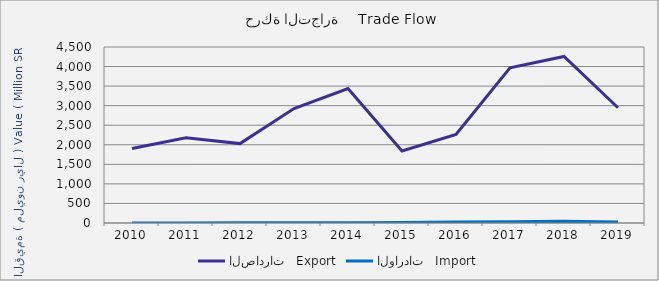
| Category | الصادرات   Export | الواردات   Import |
|---|---|---|
| 2010.0 | 1904602172 | 422353 |
| 2011.0 | 2181873037 | 906222 |
| 2012.0 | 2030709528 | 6759759 |
| 2013.0 | 2924638234 | 5864447 |
| 2014.0 | 3435334407 | 5038115 |
| 2015.0 | 1841122331 | 10072781 |
| 2016.0 | 2263575725 | 23298061 |
| 2017.0 | 3968878892 | 29802073 |
| 2018.0 | 4259177834 | 44418902 |
| 2019.0 | 2946247508 | 25713482 |